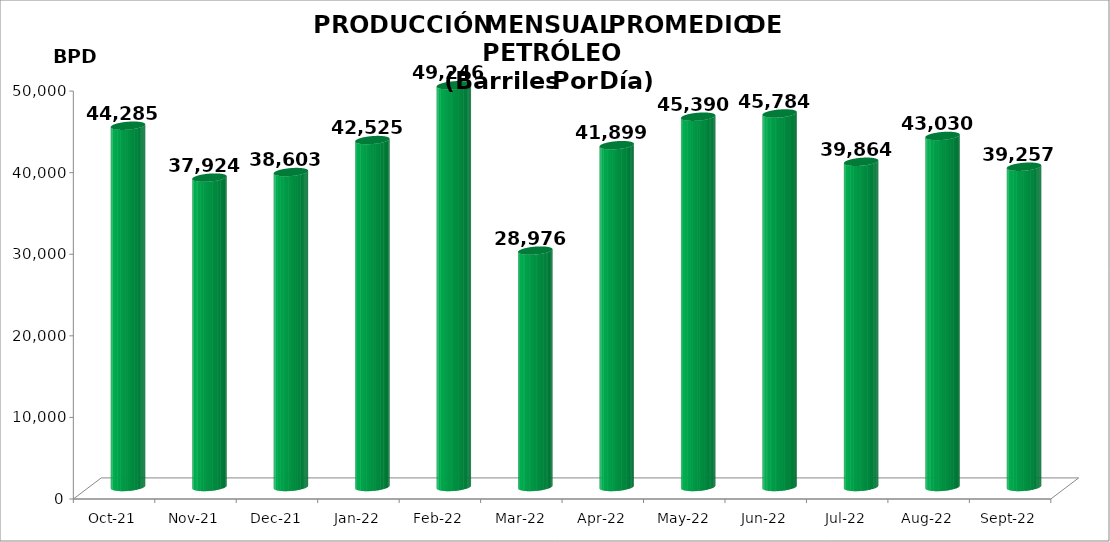
| Category | Series 0 |
|---|---|
| 2021-10-01 | 44285 |
| 2021-11-01 | 37924 |
| 2021-12-01 | 38603 |
| 2022-01-01 | 42524.516 |
| 2022-02-01 | 49246 |
| 2022-03-01 | 28976.419 |
| 2022-04-01 | 41899 |
| 2022-05-01 | 45390.387 |
| 2022-06-01 | 45784.1 |
| 2022-07-01 | 39863.677 |
| 2022-08-01 | 43030.065 |
| 2022-09-01 | 39257.333 |